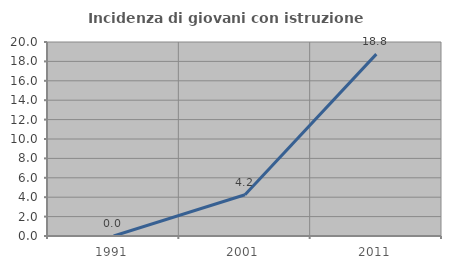
| Category | Incidenza di giovani con istruzione universitaria |
|---|---|
| 1991.0 | 0 |
| 2001.0 | 4.249 |
| 2011.0 | 18.75 |